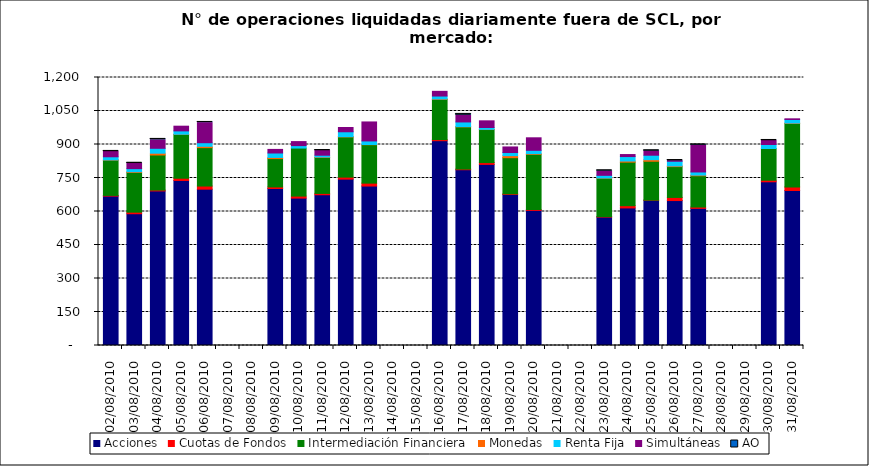
| Category | Acciones | Cuotas de Fondos | Intermediación Financiera | Monedas | Renta Fija | Simultáneas | AO |
|---|---|---|---|---|---|---|---|
| 02/08/2010 | 669 | 3 | 158 | 1 | 14 | 24 | 1 |
| 03/08/2010 | 590 | 7 | 178 | 3 | 14 | 24 | 1 |
| 04/08/2010 | 692 | 4 | 157 | 8 | 22 | 38 | 4 |
| 05/08/2010 | 739 | 10 | 196 | 1 | 15 | 21 | 0 |
| 06/08/2010 | 700 | 14 | 172 | 6 | 16 | 90 | 3 |
| 09/08/2010 | 703 | 7 | 127 | 5 | 20 | 16 | 0 |
| 10/08/2010 | 660 | 9 | 215 | 0 | 11 | 18 | 0 |
| 11/08/2010 | 675 | 6 | 161 | 2 | 8 | 21 | 1 |
| 12/08/2010 | 745 | 9 | 180 | 1 | 22 | 19 | 0 |
| 13/08/2010 | 714 | 13 | 172 | 1 | 16 | 85 | 0 |
| 16/08/2010 | 917 | 5 | 180 | 2 | 13 | 21 | 0 |
| 17/08/2010 | 787 | 3 | 189 | 1 | 21 | 30 | 6 |
| 18/08/2010 | 811 | 8 | 148 | 1 | 8 | 30 | 0 |
| 19/08/2010 | 676 | 3 | 162 | 9 | 14 | 25 | 0 |
| 20/08/2010 | 605 | 4 | 247 | 3 | 15 | 56 | 0 |
| 23/08/2010 | 575 | 2 | 172 | 1 | 12 | 19 | 3 |
| 24/08/2010 | 616 | 10 | 195 | 5 | 20 | 9 | 0 |
| 25/08/2010 | 650 | 1 | 174 | 7 | 20 | 18 | 4 |
| 26/08/2010 | 649 | 14 | 138 | 3 | 21 | 3 | 1 |
| 27/08/2010 | 614 | 6 | 140 | 3 | 14 | 120 | 3 |
| 30/08/2010 | 733 | 7 | 142 | 0 | 18 | 18 | 1 |
| 31/08/2010 | 694 | 16 | 284 | 2 | 16 | 3 | 0 |